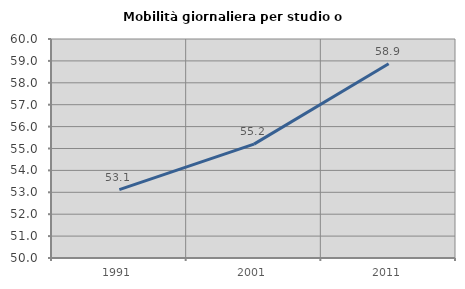
| Category | Mobilità giornaliera per studio o lavoro |
|---|---|
| 1991.0 | 53.12 |
| 2001.0 | 55.201 |
| 2011.0 | 58.872 |